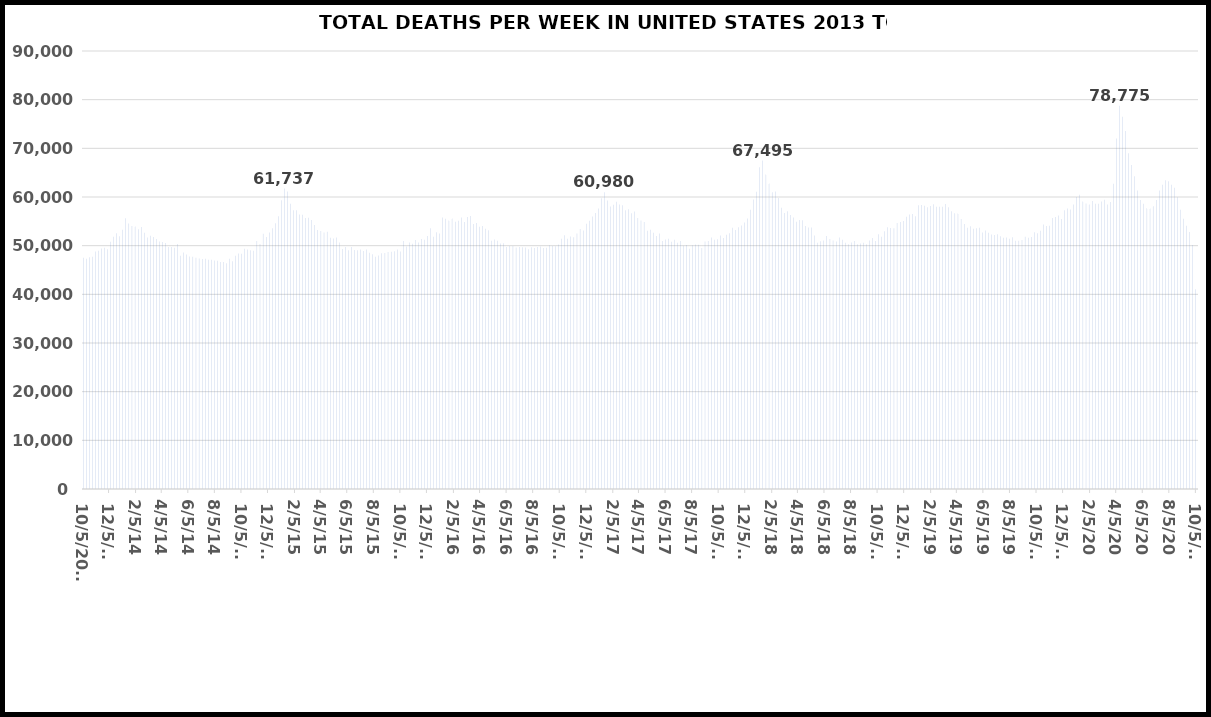
| Category | TOTAL DEATHS |
|---|---|
| 10/5/13 | 47492 |
| 10/12/13 | 47304 |
| 10/19/13 | 47602 |
| 10/26/13 | 47746 |
| 11/2/13 | 48777 |
| 11/9/13 | 48939 |
| 11/16/13 | 49409 |
| 11/23/13 | 49591 |
| 11/30/13 | 49288 |
| 12/7/13 | 50812 |
| 12/14/13 | 51848 |
| 12/21/13 | 52548 |
| 12/28/13 | 51954 |
| 1/4/14 | 53277 |
| 1/11/14 | 55620 |
| 1/18/14 | 54580 |
| 1/25/14 | 54085 |
| 2/1/14 | 53955 |
| 2/8/14 | 53397 |
| 2/15/14 | 53815 |
| 2/22/14 | 52642 |
| 3/1/14 | 51674 |
| 3/8/14 | 52058 |
| 3/15/14 | 51782 |
| 3/22/14 | 51385 |
| 3/29/14 | 50858 |
| 4/5/14 | 50749 |
| 4/12/14 | 50532 |
| 4/19/14 | 49736 |
| 4/26/14 | 49747 |
| 5/3/14 | 49590 |
| 5/10/14 | 50321 |
| 5/17/14 | 47931 |
| 5/24/14 | 48598 |
| 5/31/14 | 48163 |
| 6/7/14 | 47750 |
| 6/14/14 | 47715 |
| 6/21/14 | 47540 |
| 6/28/14 | 47341 |
| 7/5/14 | 47240 |
| 7/12/14 | 47292 |
| 7/19/14 | 47098 |
| 7/26/14 | 47122 |
| 8/2/14 | 46936 |
| 8/9/14 | 46885 |
| 8/16/14 | 46646 |
| 8/23/14 | 46631 |
| 8/30/14 | 46393 |
| 9/6/14 | 47288 |
| 9/13/14 | 46814 |
| 9/20/14 | 47944 |
| 9/27/14 | 48413 |
| 10/4/14 | 48359 |
| 10/11/14 | 49351 |
| 10/18/14 | 49224 |
| 10/25/14 | 49044 |
| 11/1/14 | 48947 |
| 11/8/14 | 50952 |
| 11/15/14 | 50361 |
| 11/22/14 | 52469 |
| 11/29/14 | 51762 |
| 12/6/14 | 52727 |
| 12/13/14 | 53554 |
| 12/20/14 | 54622 |
| 12/27/14 | 56028 |
| 1/3/15 | 59342 |
| 1/10/15 | 61737 |
| 1/17/15 | 61141 |
| 1/24/15 | 58628 |
| 1/31/15 | 57269 |
| 2/7/15 | 57284 |
| 2/14/15 | 56420 |
| 2/21/15 | 56348 |
| 2/28/15 | 55668 |
| 3/7/15 | 55732 |
| 3/14/15 | 55272 |
| 3/21/15 | 54262 |
| 3/28/15 | 53238 |
| 4/4/15 | 53009 |
| 4/11/15 | 52696 |
| 4/18/15 | 52844 |
| 4/25/15 | 51608 |
| 5/2/15 | 51466 |
| 5/9/15 | 51659 |
| 5/16/15 | 50672 |
| 5/23/15 | 49327 |
| 5/30/15 | 49718 |
| 6/6/15 | 49041 |
| 6/13/15 | 49751 |
| 6/20/15 | 49109 |
| 6/27/15 | 49057 |
| 7/4/15 | 49218 |
| 7/11/15 | 48917 |
| 7/18/15 | 49227 |
| 7/25/15 | 48548 |
| 8/1/15 | 48258 |
| 8/8/15 | 47732 |
| 8/15/15 | 47977 |
| 8/22/15 | 48438 |
| 8/29/15 | 48496 |
| 9/5/15 | 48723 |
| 9/12/15 | 48762 |
| 9/19/15 | 48857 |
| 9/26/15 | 49228 |
| 10/3/15 | 48805 |
| 10/10/15 | 50950 |
| 10/17/15 | 49830 |
| 10/24/15 | 50667 |
| 10/31/15 | 50384 |
| 11/7/15 | 51158 |
| 11/14/15 | 50668 |
| 11/21/15 | 51387 |
| 11/28/15 | 51196 |
| 12/5/15 | 51996 |
| 12/12/15 | 53556 |
| 12/19/15 | 51842 |
| 12/26/15 | 52761 |
| 1/2/16 | 52490 |
| 1/9/16 | 55788 |
| 1/16/16 | 55525 |
| 1/23/16 | 55182 |
| 1/30/16 | 55606 |
| 2/6/16 | 54896 |
| 2/13/16 | 55106 |
| 2/20/16 | 55785 |
| 2/27/16 | 54873 |
| 3/5/16 | 55875 |
| 3/12/16 | 56112 |
| 3/19/16 | 54462 |
| 3/26/16 | 54662 |
| 4/2/16 | 53880 |
| 4/9/16 | 54066 |
| 4/16/16 | 53490 |
| 4/23/16 | 53149 |
| 4/30/16 | 51027 |
| 5/7/16 | 51270 |
| 5/14/16 | 51000 |
| 5/21/16 | 50469 |
| 5/28/16 | 50490 |
| 6/4/16 | 49711 |
| 6/11/16 | 49917 |
| 6/18/16 | 49910 |
| 6/25/16 | 49623 |
| 7/2/16 | 49746 |
| 7/9/16 | 49698 |
| 7/16/16 | 49637 |
| 7/23/16 | 49275 |
| 7/30/16 | 49698 |
| 8/6/16 | 49505 |
| 8/13/16 | 49740 |
| 8/20/16 | 49809 |
| 8/27/16 | 49509 |
| 9/3/16 | 49576 |
| 9/10/16 | 50075 |
| 9/17/16 | 49915 |
| 9/24/16 | 49876 |
| 10/1/16 | 50254 |
| 10/8/16 | 51400 |
| 10/15/16 | 52124 |
| 10/22/16 | 51436 |
| 10/29/16 | 51864 |
| 11/5/16 | 51741 |
| 11/12/16 | 52524 |
| 11/19/16 | 53442 |
| 11/26/16 | 53128 |
| 12/3/16 | 54496 |
| 12/10/16 | 55133 |
| 12/17/16 | 55977 |
| 12/24/16 | 56696 |
| 12/31/16 | 57613 |
| 1/7/17 | 59763 |
| 1/14/17 | 60980 |
| 1/21/17 | 59293 |
| 1/28/17 | 58047 |
| 2/4/17 | 58431 |
| 2/11/17 | 59037 |
| 2/18/17 | 58478 |
| 2/25/17 | 58287 |
| 3/4/17 | 57256 |
| 3/11/17 | 57476 |
| 3/18/17 | 56656 |
| 3/25/17 | 57045 |
| 4/1/17 | 55701 |
| 4/8/17 | 55160 |
| 4/15/17 | 54861 |
| 4/22/17 | 53070 |
| 4/29/17 | 53295 |
| 5/6/17 | 52656 |
| 5/13/17 | 51985 |
| 5/20/17 | 52480 |
| 5/27/17 | 50970 |
| 6/3/17 | 51256 |
| 6/10/17 | 51418 |
| 6/17/17 | 50797 |
| 6/24/17 | 51193 |
| 7/1/17 | 50617 |
| 7/8/17 | 50958 |
| 7/15/17 | 49972 |
| 7/22/17 | 50125 |
| 7/29/17 | 49361 |
| 8/5/17 | 50087 |
| 8/12/17 | 50234 |
| 8/19/17 | 50185 |
| 8/26/17 | 49516 |
| 9/2/17 | 50831 |
| 9/9/17 | 50978 |
| 9/16/17 | 51693 |
| 9/23/17 | 51229 |
| 9/30/17 | 51341 |
| 10/7/17 | 52107 |
| 10/14/17 | 51576 |
| 10/21/17 | 52222 |
| 10/28/17 | 52542 |
| 11/4/17 | 53667 |
| 11/11/17 | 53240 |
| 11/18/17 | 53767 |
| 11/25/17 | 54120 |
| 12/2/17 | 54759 |
| 12/9/17 | 55595 |
| 12/16/17 | 57370 |
| 12/23/17 | 59505 |
| 12/30/17 | 61090 |
| 1/6/18 | 66134 |
| 1/13/18 | 67495 |
| 1/20/18 | 64647 |
| 1/27/18 | 62780 |
| 2/3/18 | 60974 |
| 2/10/18 | 61110 |
| 2/17/18 | 59779 |
| 2/24/18 | 57793 |
| 3/3/18 | 56692 |
| 3/10/18 | 57093 |
| 3/17/18 | 56326 |
| 3/24/18 | 55766 |
| 3/31/18 | 54918 |
| 4/7/18 | 55294 |
| 4/14/18 | 55228 |
| 4/21/18 | 54038 |
| 4/28/18 | 53727 |
| 5/5/18 | 53741 |
| 5/12/18 | 52105 |
| 5/19/18 | 50618 |
| 5/26/18 | 50929 |
| 6/2/18 | 51045 |
| 6/9/18 | 52001 |
| 6/16/18 | 51387 |
| 6/23/18 | 51044 |
| 6/30/18 | 50855 |
| 7/7/18 | 51684 |
| 7/14/18 | 51191 |
| 7/21/18 | 50609 |
| 7/28/18 | 50274 |
| 8/4/18 | 50637 |
| 8/11/18 | 50967 |
| 8/18/18 | 50301 |
| 8/25/18 | 50459 |
| 9/1/18 | 50611 |
| 9/8/18 | 50299 |
| 9/15/18 | 51083 |
| 9/22/18 | 51583 |
| 9/29/18 | 50959 |
| 10/6/18 | 52357 |
| 10/13/18 | 51849 |
| 10/20/18 | 52979 |
| 10/27/18 | 53763 |
| 11/3/18 | 53638 |
| 11/10/18 | 53561 |
| 11/17/18 | 54698 |
| 11/24/18 | 54847 |
| 12/1/18 | 55060 |
| 12/8/18 | 55967 |
| 12/15/18 | 56387 |
| 12/22/18 | 56528 |
| 12/29/18 | 56026 |
| 1/5/19 | 58299 |
| 1/12/19 | 58362 |
| 1/19/19 | 58220 |
| 1/26/19 | 57908 |
| 2/2/19 | 58152 |
| 2/9/19 | 58523 |
| 2/16/19 | 58000 |
| 2/23/19 | 58005 |
| 3/2/19 | 57972 |
| 3/9/19 | 58546 |
| 3/16/19 | 57917 |
| 3/23/19 | 57095 |
| 3/30/19 | 56675 |
| 4/6/19 | 56598 |
| 4/13/19 | 55492 |
| 4/20/19 | 54468 |
| 4/27/19 | 53656 |
| 5/4/19 | 53987 |
| 5/11/19 | 53478 |
| 5/18/19 | 53578 |
| 5/25/19 | 53695 |
| 6/1/19 | 52727 |
| 6/8/19 | 53141 |
| 6/15/19 | 52646 |
| 6/22/19 | 52291 |
| 6/29/19 | 52209 |
| 7/6/19 | 52344 |
| 7/13/19 | 51931 |
| 7/20/19 | 51649 |
| 7/27/19 | 51662 |
| 8/3/19 | 51410 |
| 8/10/19 | 51747 |
| 8/17/19 | 51023 |
| 8/24/19 | 51022 |
| 8/31/19 | 51162 |
| 9/7/19 | 51836 |
| 9/14/19 | 51633 |
| 9/21/19 | 51757 |
| 9/28/19 | 52757 |
| 10/5/19 | 52564 |
| 10/12/19 | 53090 |
| 10/19/19 | 54338 |
| 10/26/19 | 54049 |
| 11/2/19 | 54087 |
| 11/9/19 | 55699 |
| 11/16/19 | 55886 |
| 11/23/19 | 56199 |
| 11/30/19 | 55465 |
| 12/7/19 | 57303 |
| 12/14/19 | 57658 |
| 12/21/19 | 57424 |
| 12/28/19 | 58458 |
| 1/4/20 | 59982 |
| 1/11/20 | 60482 |
| 1/18/20 | 59061 |
| 1/25/20 | 58679 |
| 2/1/20 | 58481 |
| 2/8/20 | 59190 |
| 2/15/20 | 58619 |
| 2/22/20 | 58624 |
| 2/29/20 | 59068 |
| 3/7/20 | 59459 |
| 3/14/20 | 58441 |
| 3/21/20 | 58991 |
| 3/28/20 | 62748 |
| 4/4/20 | 72013 |
| 4/11/20 | 78775 |
| 4/18/20 | 76477 |
| 4/25/20 | 73539 |
| 5/2/20 | 68968 |
| 5/9/20 | 66571 |
| 5/16/20 | 64252 |
| 5/23/20 | 61344 |
| 5/30/20 | 59394 |
| 6/6/20 | 58602 |
| 6/13/20 | 57701 |
| 6/20/20 | 57633 |
| 6/27/20 | 58102 |
| 7/4/20 | 59358 |
| 7/11/20 | 61343 |
| 7/18/20 | 62493 |
| 7/25/20 | 63460 |
| 8/1/20 | 63246 |
| 8/8/20 | 62539 |
| 8/15/20 | 61895 |
| 8/22/20 | 59964 |
| 8/29/20 | 57371 |
| 9/5/20 | 55523 |
| 9/12/20 | 54111 |
| 9/19/20 | 52799 |
| 9/26/20 | 50148 |
| 10/3/20 | 41048 |
| 10/10/20 | 20961 |